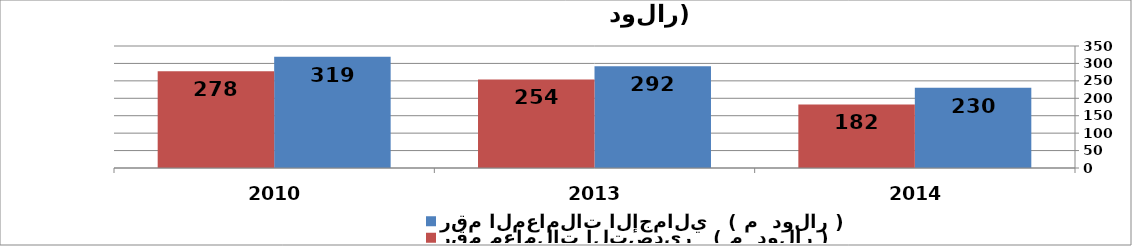
| Category | رقم المعاملات الإجمالي   ( م  دولار ) | رقم معاملات التصدير   ( م  دولار ) |
|---|---|---|
| 2014.0 | 230.318 | 182.497 |
| 2013.0 | 292.213 | 254.005 |
| 2010.0 | 319.231 | 277.596 |